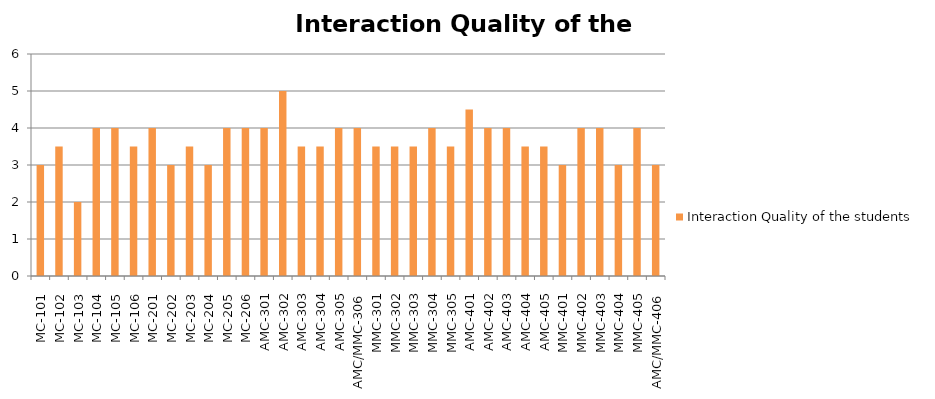
| Category | Interaction Quality of the students |
|---|---|
| MC-101 | 3 |
| MC-102 | 3.5 |
| MC-103 | 2 |
| MC-104 | 4 |
| MC-105 | 4 |
| MC-106 | 3.5 |
| MC-201 | 4 |
| MC-202 | 3 |
| MC-203 | 3.5 |
| MC-204 | 3 |
| MC-205 | 4 |
| MC-206 | 4 |
| AMC-301 | 4 |
| AMC-302 | 5 |
| AMC-303 | 3.5 |
| AMC-304 | 3.5 |
| AMC-305 | 4 |
| AMC/MMC-306 | 4 |
| MMC-301 | 3.5 |
| MMC-302 | 3.5 |
| MMC-303 | 3.5 |
| MMC-304 | 4 |
| MMC-305 | 3.5 |
| AMC-401 | 4.5 |
| AMC-402 | 4 |
| AMC-403 | 4 |
| AMC-404 | 3.5 |
| AMC-405 | 3.5 |
| MMC-401 | 3 |
| MMC-402 | 4 |
| MMC-403 | 4 |
| MMC-404 | 3 |
| MMC-405 | 4 |
| AMC/MMC-406 | 3 |